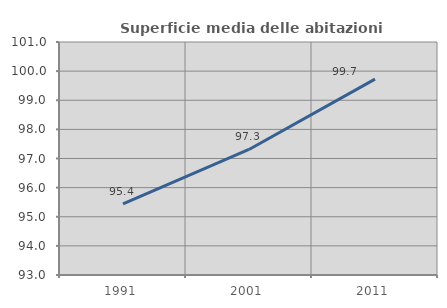
| Category | Superficie media delle abitazioni occupate |
|---|---|
| 1991.0 | 95.446 |
| 2001.0 | 97.311 |
| 2011.0 | 99.726 |